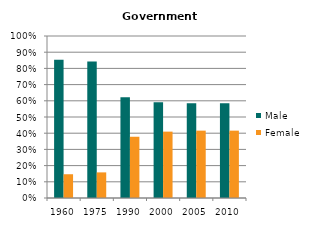
| Category | Male | Female |
|---|---|---|
| 1960.0 | 0.853 | 0.147 |
| 1975.0 | 0.842 | 0.158 |
| 1990.0 | 0.622 | 0.378 |
| 2000.0 | 0.59 | 0.41 |
| 2005.0 | 0.584 | 0.416 |
| 2010.0 | 0.584 | 0.416 |